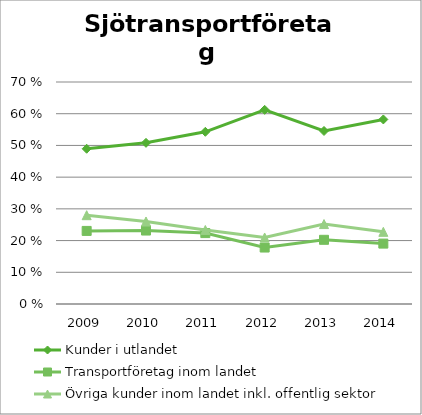
| Category | Kunder i utlandet | Transportföretag inom landet | Övriga kunder inom landet inkl. offentlig sektor |
|---|---|---|---|
| 2009.0 | 0.49 | 0.23 | 0.28 |
| 2010.0 | 0.508 | 0.232 | 0.26 |
| 2011.0 | 0.543 | 0.224 | 0.233 |
| 2012.0 | 0.612 | 0.178 | 0.21 |
| 2013.0 | 0.546 | 0.202 | 0.252 |
| 2014.0 | 0.582 | 0.19 | 0.228 |